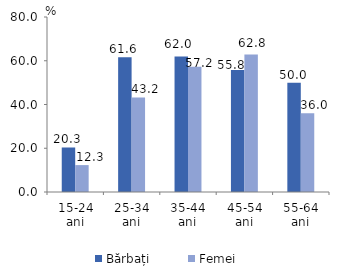
| Category | Bărbați | Femei |
|---|---|---|
| 15-24 ani | 20.348 | 12.3 |
| 25-34 ani | 61.616 | 43.212 |
| 35-44 ani | 61.96 | 57.221 |
| 45-54 ani | 55.826 | 62.85 |
| 55-64 ani | 49.95 | 36.004 |